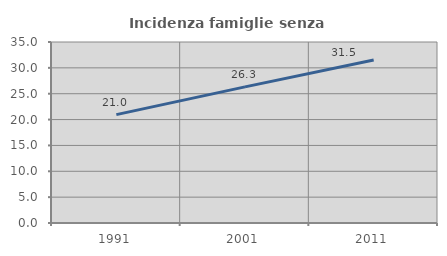
| Category | Incidenza famiglie senza nuclei |
|---|---|
| 1991.0 | 20.959 |
| 2001.0 | 26.321 |
| 2011.0 | 31.532 |